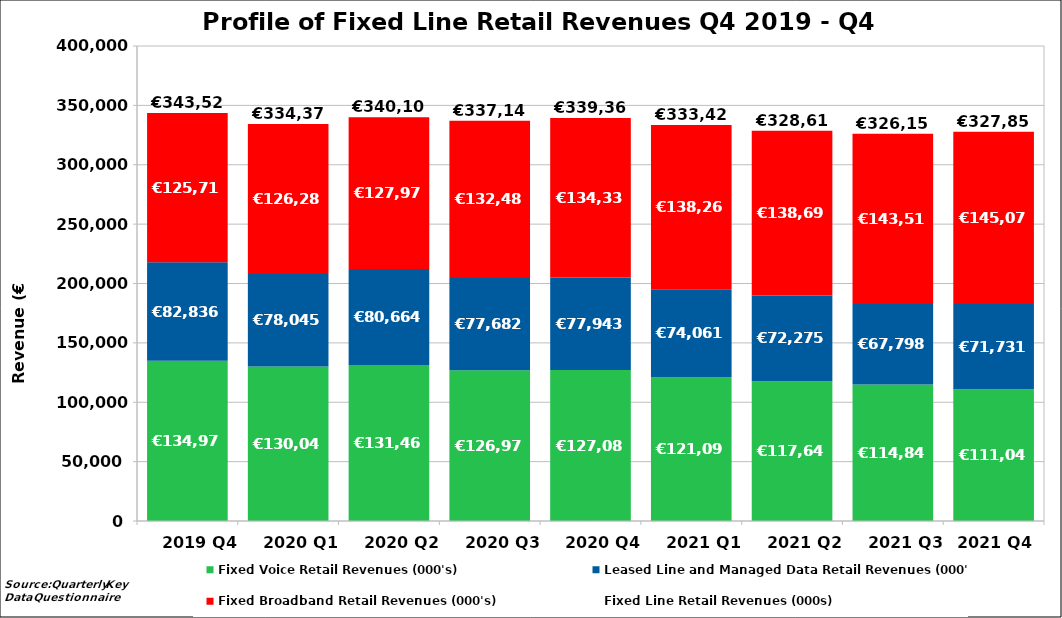
| Category | Fixed Voice Retail Revenues (000's) | Leased Line and Managed Data Retail Revenues (000's) | Fixed Broadband Retail Revenues (000's) | Fixed Line Retail Revenues (000s) |
|---|---|---|---|---|
| 2019 Q4 | 134974.348 | 82836.465 | 125716.694 | 343527.507 |
| 2020 Q1 | 130043.862 | 78045.335 | 126285 | 334374.197 |
| 2020 Q2 | 131462.059 | 80663.523 | 127977 | 340102.583 |
| 2020 Q3 | 126978.412 | 77682.016 | 132484 | 337144.428 |
| 2020 Q4 | 127088.713 | 77942.51 | 134334 | 339365.223 |
| 2021 Q1 | 121092.837 | 74061.348 | 138268 | 333422.185 |
| 2021 Q2 | 117646.167 | 72274.779 | 138698 | 328618.946 |
| 2021 Q3 | 114842.607 | 67798.35 | 143518 | 326158.957 |
| 2021 Q4  | 111043.728 | 71730.75 | 145076 | 327850.478 |